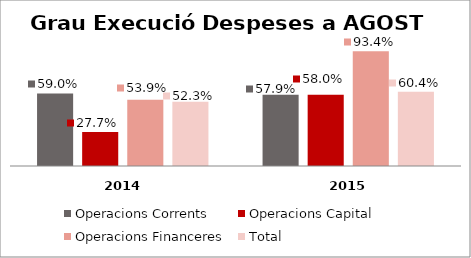
| Category | Operacions Corrents | Operacions Capital | Operacions Financeres | Total |
|---|---|---|---|---|
| 0 | 0.59 | 0.277 | 0.539 | 0.523 |
| 1 | 0.579 | 0.58 | 0.934 | 0.604 |